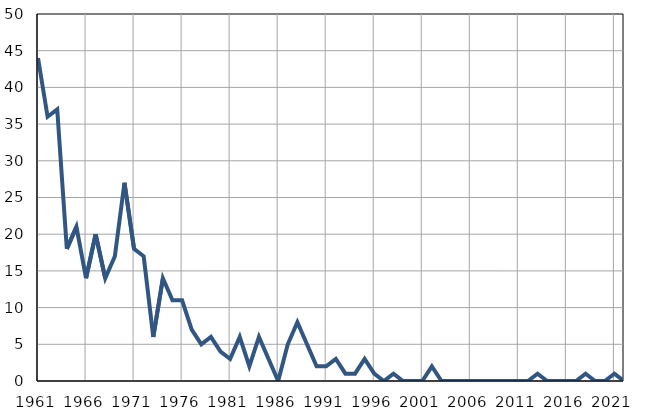
| Category | Infants
deaths |
|---|---|
| 1961.0 | 44 |
| 1962.0 | 36 |
| 1963.0 | 37 |
| 1964.0 | 18 |
| 1965.0 | 21 |
| 1966.0 | 14 |
| 1967.0 | 20 |
| 1968.0 | 14 |
| 1969.0 | 17 |
| 1970.0 | 27 |
| 1971.0 | 18 |
| 1972.0 | 17 |
| 1973.0 | 6 |
| 1974.0 | 14 |
| 1975.0 | 11 |
| 1976.0 | 11 |
| 1977.0 | 7 |
| 1978.0 | 5 |
| 1979.0 | 6 |
| 1980.0 | 4 |
| 1981.0 | 3 |
| 1982.0 | 6 |
| 1983.0 | 2 |
| 1984.0 | 6 |
| 1985.0 | 3 |
| 1986.0 | 0 |
| 1987.0 | 5 |
| 1988.0 | 8 |
| 1989.0 | 5 |
| 1990.0 | 2 |
| 1991.0 | 2 |
| 1992.0 | 3 |
| 1993.0 | 1 |
| 1994.0 | 1 |
| 1995.0 | 3 |
| 1996.0 | 1 |
| 1997.0 | 0 |
| 1998.0 | 1 |
| 1999.0 | 0 |
| 2000.0 | 0 |
| 2001.0 | 0 |
| 2002.0 | 2 |
| 2003.0 | 0 |
| 2004.0 | 0 |
| 2005.0 | 0 |
| 2006.0 | 0 |
| 2007.0 | 0 |
| 2008.0 | 0 |
| 2009.0 | 0 |
| 2010.0 | 0 |
| 2011.0 | 0 |
| 2012.0 | 0 |
| 2013.0 | 1 |
| 2014.0 | 0 |
| 2015.0 | 0 |
| 2016.0 | 0 |
| 2017.0 | 0 |
| 2018.0 | 1 |
| 2019.0 | 0 |
| 2020.0 | 0 |
| 2021.0 | 1 |
| 2022.0 | 0 |